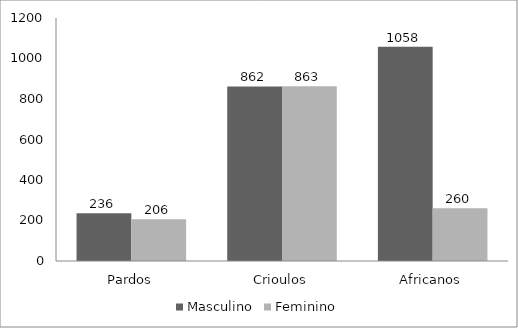
| Category | Masculino | Feminino |
|---|---|---|
| Pardos | 236 | 206 |
| Crioulos | 862 | 863 |
| Africanos | 1058 | 260 |